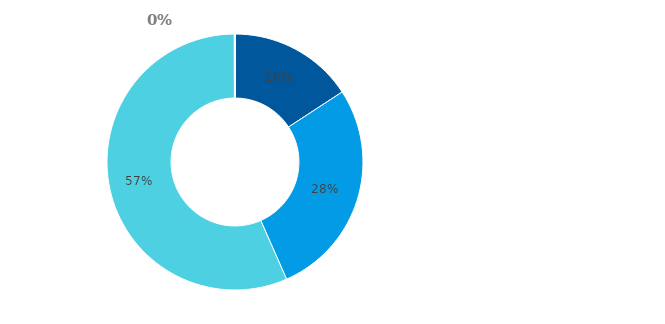
| Category | Series 3 |
|---|---|
| Hotovost | 0.158 |
| Půjčky poskytnuté nemovitostní společnosti | 0.276 |
| Majetkové účasti v nemovitostní společnosti | 0.566 |
| Ostatní finanční aktiva | 0 |